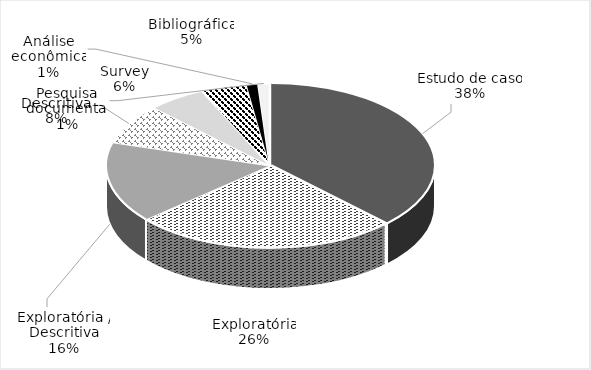
| Category | Series 0 |
|---|---|
| Estudo de caso | 33 |
| Exploratória | 23 |
| Exploratória / Descritiva | 14 |
| Descritiva | 7 |
| Survey | 5 |
| Bibliográfica | 4 |
| Análise econômica | 1 |
| Pesquisa documental | 1 |